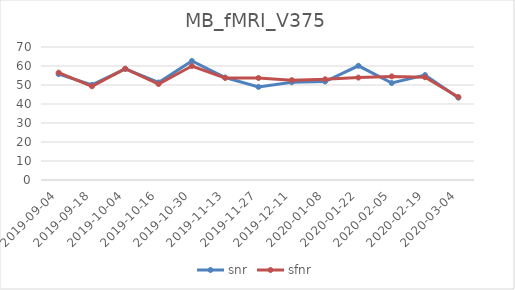
| Category | snr | sfnr |
|---|---|---|
| 2019-09-04 | 55.721 | 56.499 |
| 2019-09-18 | 50.04 | 49.321 |
| 2019-10-04 | 58.481 | 58.575 |
| 2019-10-16 | 51.317 | 50.497 |
| 2019-10-30 | 62.651 | 59.984 |
| 2019-11-13 | 53.918 | 53.739 |
| 2019-11-27 | 49.012 | 53.691 |
| 2019-12-11 | 51.475 | 52.56 |
| 2020-01-08 | 51.834 | 53.026 |
| 2020-01-22 | 60.107 | 53.897 |
| 2020-02-05 | 51.046 | 54.535 |
| 2020-02-19 | 55.219 | 54.088 |
| 2020-03-04 | 43.326 | 43.692 |